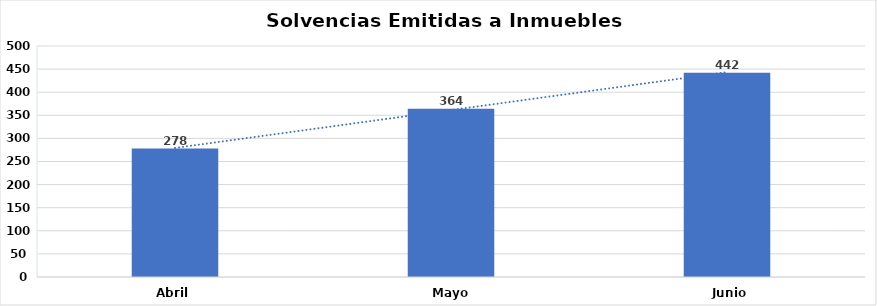
| Category | Series 0 |
|---|---|
| Abril  | 278 |
| Mayo | 364 |
| Junio | 442 |